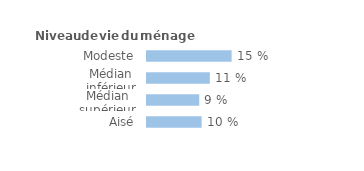
| Category | Series 0 |
|---|---|
| Modeste | 0.15 |
| Médian inférieur | 0.112 |
| Médian supérieur | 0.093 |
| Aisé | 0.097 |